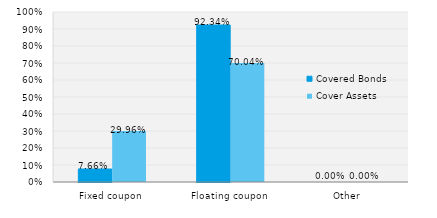
| Category | Covered Bonds | Cover Assets |
|---|---|---|
| Fixed coupon | 0.077 | 0.3 |
| Floating coupon | 0.923 | 0.7 |
| Other | 0 | 0 |